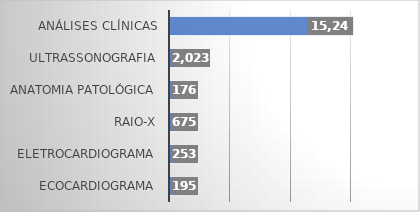
| Category | Series 0 |
|---|---|
| ECOCARDIOGRAMA | 195 |
| ELETROCARDIOGRAMA | 253 |
| RAIO-X | 675 |
| ANATOMIA PATOLÓGICA | 176 |
| ULTRASSONOGRAFIA | 2023 |
| ANÁLISES CLÍNICAS | 15247 |